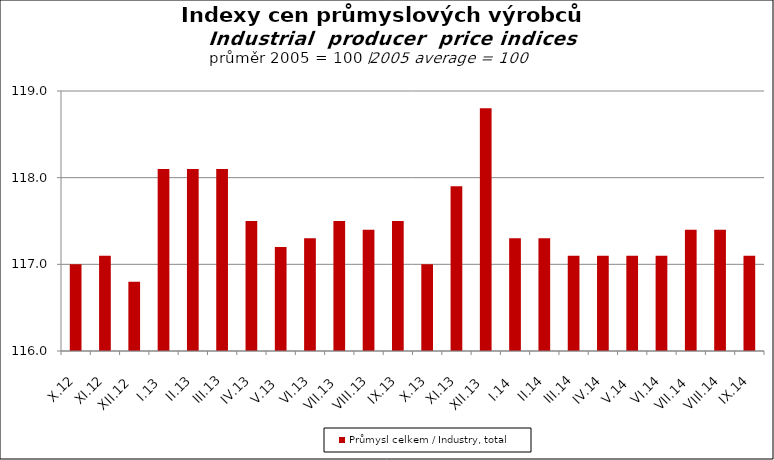
| Category | Průmysl celkem / Industry, total |
|---|---|
| X.12 | 117 |
| XI.12 | 117.1 |
| XII.12 | 116.8 |
| I.13 | 118.1 |
| II.13 | 118.1 |
| III.13 | 118.1 |
| IV.13 | 117.5 |
| V.13 | 117.2 |
| VI.13 | 117.3 |
| VII.13 | 117.5 |
| VIII.13 | 117.4 |
| IX.13 | 117.5 |
| X.13 | 117 |
| XI.13 | 117.9 |
| XII.13 | 118.8 |
| I.14 | 117.3 |
| II.14 | 117.3 |
| III.14 | 117.1 |
| IV.14 | 117.1 |
| V.14 | 117.1 |
| VI.14 | 117.1 |
| VII.14 | 117.4 |
| VIII.14 | 117.4 |
| IX.14 | 117.1 |